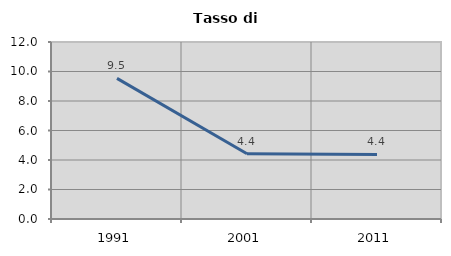
| Category | Tasso di disoccupazione   |
|---|---|
| 1991.0 | 9.537 |
| 2001.0 | 4.427 |
| 2011.0 | 4.381 |